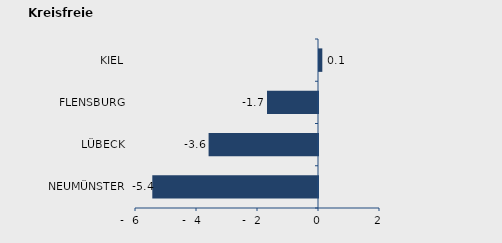
| Category | Überschuss der Geborenen (+) bzw. Gestorbenen (-) |
|---|---|
| NEUMÜNSTER | -5.433 |
| LÜBECK | -3.587 |
| FLENSBURG | -1.672 |
| KIEL | 0.109 |